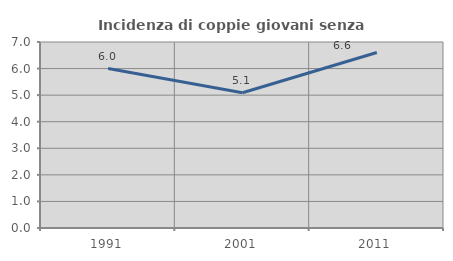
| Category | Incidenza di coppie giovani senza figli |
|---|---|
| 1991.0 | 6 |
| 2001.0 | 5.088 |
| 2011.0 | 6.606 |